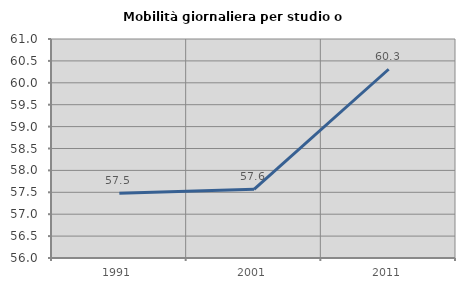
| Category | Mobilità giornaliera per studio o lavoro |
|---|---|
| 1991.0 | 57.48 |
| 2001.0 | 57.567 |
| 2011.0 | 60.309 |